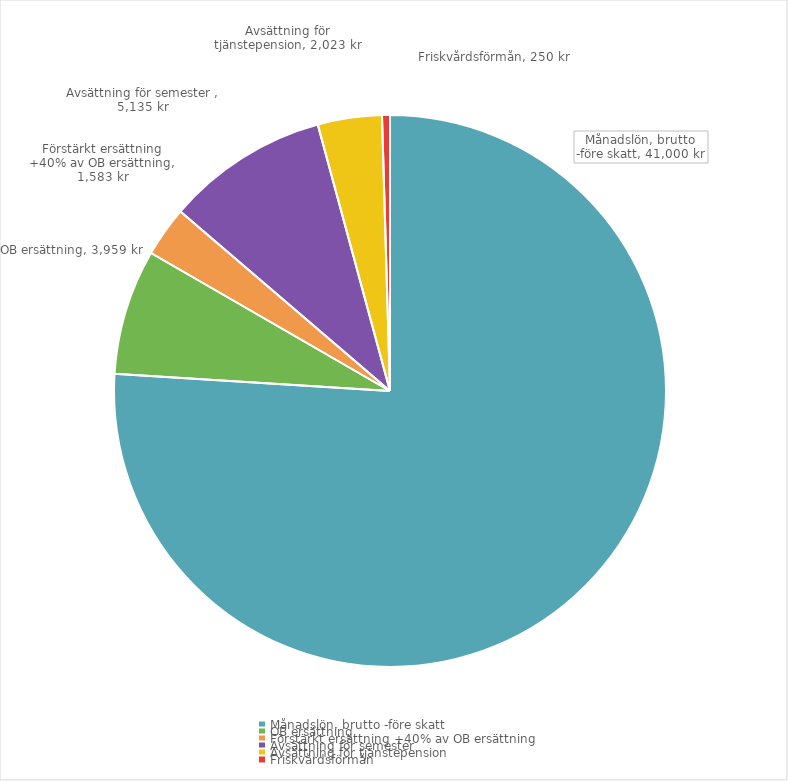
| Category | Series 0 |
|---|---|
| Månadslön, brutto -före skatt | 41000 |
| OB ersättning | 3958.5 |
| Förstärkt ersättning +40% av OB ersättning | 1583.4 |
| Avsättning för semester  | 5135.354 |
| Avsättning för tjänstepension | 2023.132 |
| Friskvårdsförmån | 250 |